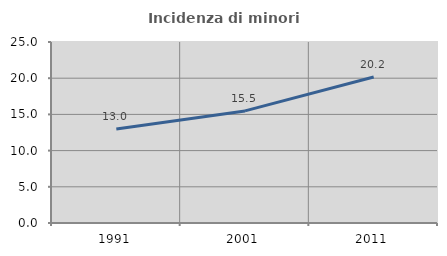
| Category | Incidenza di minori stranieri |
|---|---|
| 1991.0 | 12.977 |
| 2001.0 | 15.484 |
| 2011.0 | 20.172 |